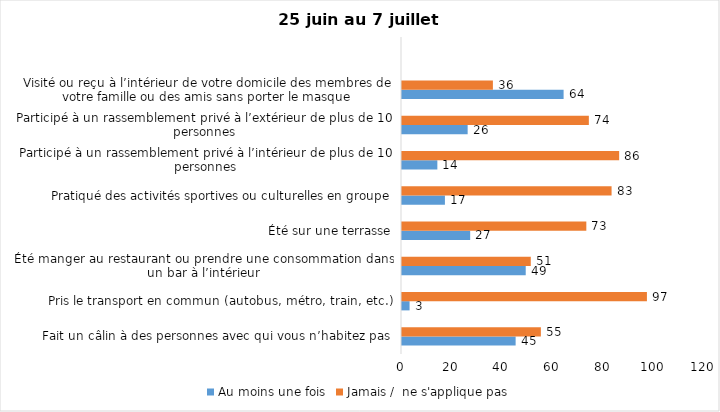
| Category | Au moins une fois | Jamais /  ne s'applique pas |
|---|---|---|
| Fait un câlin à des personnes avec qui vous n’habitez pas | 45 | 55 |
| Pris le transport en commun (autobus, métro, train, etc.) | 3 | 97 |
| Été manger au restaurant ou prendre une consommation dans un bar à l’intérieur | 49 | 51 |
| Été sur une terrasse | 27 | 73 |
| Pratiqué des activités sportives ou culturelles en groupe | 17 | 83 |
| Participé à un rassemblement privé à l’intérieur de plus de 10 personnes | 14 | 86 |
| Participé à un rassemblement privé à l’extérieur de plus de 10 personnes | 26 | 74 |
| Visité ou reçu à l’intérieur de votre domicile des membres de votre famille ou des amis sans porter le masque | 64 | 36 |